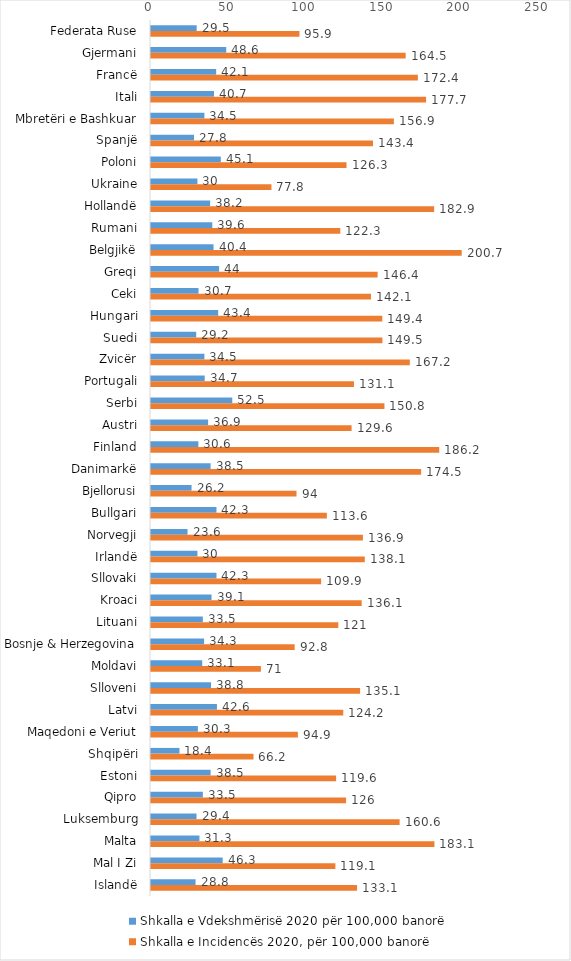
| Category |  Shkalla e Vdekshmërisë 2020 për 100,000 banorë  |  Shkalla e Incidencës 2020, për 100,000 banorë  |
|---|---|---|
| Federata Ruse | 29.5 | 95.9 |
| Gjermani | 48.6 | 164.5 |
| Francë | 42.1 | 172.4 |
| Itali | 40.7 | 177.7 |
| Mbretëri e Bashkuar | 34.5 | 156.9 |
| Spanjë | 27.8 | 143.4 |
| Poloni | 45.1 | 126.3 |
| Ukraine | 30 | 77.8 |
| Hollandë | 38.2 | 182.9 |
| Rumani | 39.6 | 122.3 |
| Belgjikë | 40.4 | 200.7 |
| Greqi | 44 | 146.4 |
| Ceki | 30.7 | 142.1 |
| Hungari | 43.4 | 149.4 |
| Suedi | 29.2 | 149.5 |
| Zvicër | 34.5 | 167.2 |
| Portugali | 34.7 | 131.1 |
| Serbi | 52.5 | 150.8 |
| Austri | 36.9 | 129.6 |
| Finland | 30.6 | 186.2 |
| Danimarkë | 38.5 | 174.5 |
| Bjellorusi | 26.2 | 94 |
| Bullgari | 42.3 | 113.6 |
| Norvegji | 23.6 | 136.9 |
| Irlandë | 30 | 138.1 |
| Sllovaki | 42.3 | 109.9 |
| Kroaci | 39.1 | 136.1 |
| Lituani | 33.5 | 121 |
| Bosnje & Herzegovina | 34.3 | 92.8 |
| Moldavi | 33.1 | 71 |
| Slloveni | 38.8 | 135.1 |
| Latvi | 42.6 | 124.2 |
| Maqedoni e Veriut | 30.3 | 94.9 |
| Shqipëri | 18.4 | 66.2 |
| Estoni | 38.5 | 119.6 |
| Qipro | 33.5 | 126 |
| Luksemburg | 29.4 | 160.6 |
| Malta | 31.3 | 183.1 |
| Mal I Zi | 46.3 | 119.1 |
| Islandë | 28.8 | 133.1 |